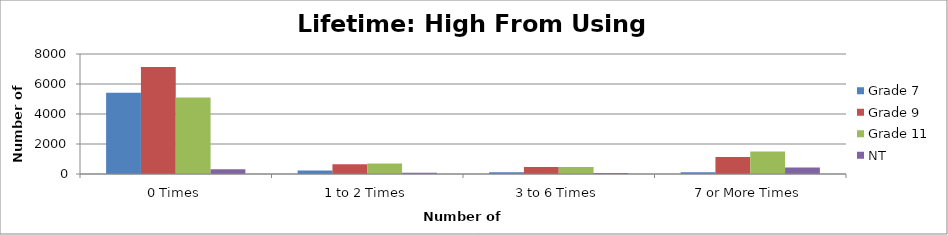
| Category | Grade 7 | Grade 9 | Grade 11 | NT |
|---|---|---|---|---|
| 0 Times | 5421.56 | 7128.04 | 5107.05 | 312.55 |
| 1 to 2 Times | 235.72 | 656.53 | 707.13 | 89.3 |
| 3 to 6 Times | 117.86 | 468.95 | 471.42 | 62.51 |
| 7 or More Times | 117.86 | 1125.48 | 1492.83 | 428.64 |